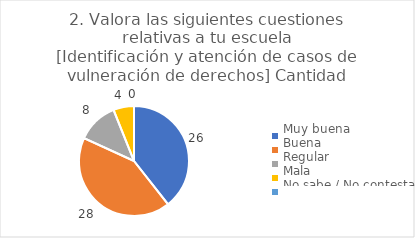
| Category | 2. Valora las siguientes cuestiones relativas a tu escuela
[Identificación y atención de casos de vulneración de derechos] |
|---|---|
| Muy buena  | 0.394 |
| Buena  | 0.424 |
| Regular  | 0.121 |
| Mala  | 0.061 |
| No sabe / No contesta | 0 |